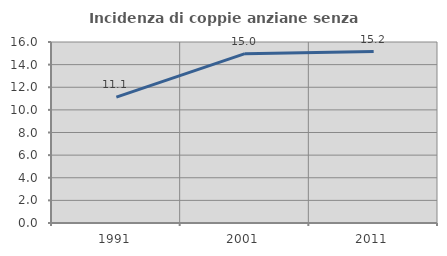
| Category | Incidenza di coppie anziane senza figli  |
|---|---|
| 1991.0 | 11.132 |
| 2001.0 | 14.967 |
| 2011.0 | 15.156 |